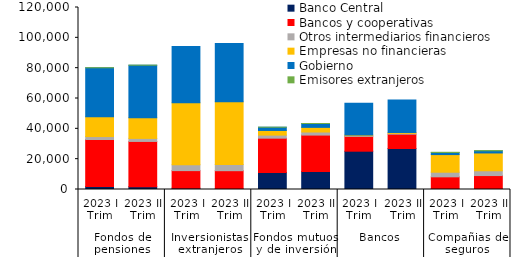
| Category | Banco Central | Bancos y cooperativas | Otros intermediarios financieros | Empresas no financieras | Gobierno  | Emisores extranjeros |
|---|---|---|---|---|---|---|
| 0 | 2011.732 | 30940.138 | 1949.812 | 13080.663 | 32273.896 | 35.575 |
| 1 | 1876.175 | 29812.881 | 1997.356 | 13682.301 | 34586.761 | 36.089 |
| 2 | 866.443 | 11578.409 | 3892.315 | 40869.393 | 37009.908 | 0 |
| 3 | 375.182 | 12026.794 | 4088.054 | 41371.758 | 38381.065 | 0 |
| 4 | 11217.197 | 22632.304 | 2017.367 | 3060.785 | 2137.509 | 0.178 |
| 5 | 11830.571 | 24051.233 | 2024.842 | 3058.508 | 2552.397 | 0.18 |
| 6 | 25260.203 | 9747.281 | 532.621 | 414.29 | 20901.783 | 0 |
| 7 | 27039.733 | 9447.593 | 533.391 | 537.165 | 21535.472 | 0 |
| 8 | 177.145 | 8173.329 | 3037.821 | 11627.934 | 1395.287 | 122.771 |
| 9 | 344.651 | 8848.735 | 3156.75 | 11745.39 | 1431.83 | 124.545 |